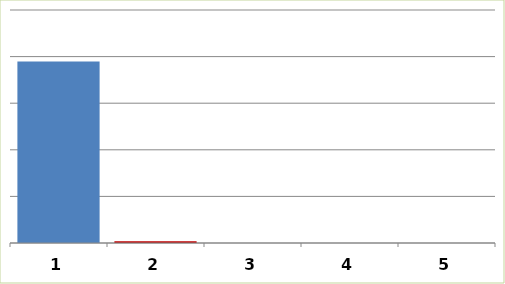
| Category | Series 0 |
|---|---|
| 0 | 1946140.4 |
| 1 | 20000 |
| 2 | 0 |
| 3 | 0 |
| 4 | 0 |